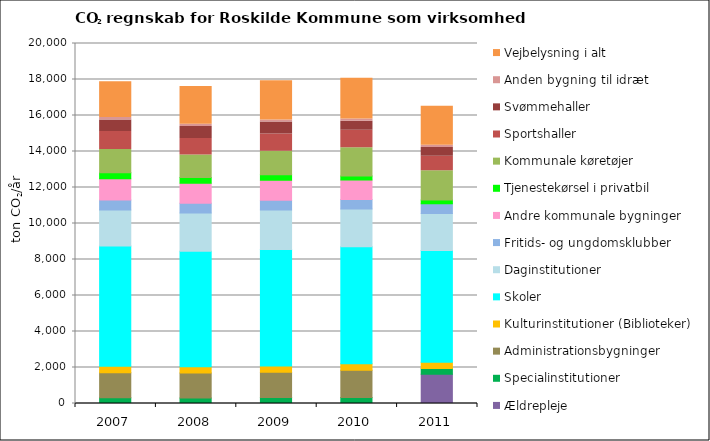
| Category | Ældrepleje | Specialinstitutioner | Administrationsbygninger | Kulturinstitutioner (Biblioteker) | Skoler | Daginstitutioner | Fritids- og ungdomsklubber | Andre kommunale bygninger | Tjenestekørsel i privatbil | Kommunale køretøjer | Sportshaller | Svømmehaller | Anden bygning til idræt | Vejbelysning i alt |
|---|---|---|---|---|---|---|---|---|---|---|---|---|---|---|
| 2007.0 | 0 | 316.544 | 1389.446 | 369.022 | 6676.339 | 2002.385 | 547.636 | 1187.609 | 325.086 | 1297.154 | 997.976 | 640.79 | 133.08 | 1989.346 |
| 2008.0 | 0 | 309.677 | 1388.317 | 338.572 | 6420.941 | 2126.266 | 537.524 | 1121.291 | 314.2 | 1244.761 | 926.201 | 659.856 | 130.123 | 2092.846 |
| 2009.0 | 0 | 327.222 | 1412.44 | 337.569 | 6474.933 | 2197.595 | 542.109 | 1104.341 | 306.237 | 1317.469 | 946.638 | 666.363 | 123.948 | 2173.098 |
| 2010.0 | 0 | 331.244 | 1518.906 | 359.926 | 6495.503 | 2100.714 | 527.316 | 1086.78 | 215.672 | 1572.515 | 969.566 | 504.925 | 122.492 | 2257.444 |
| 2011.0 | 1630.289 | 318.15 | 0 | 340.085 | 6209.982 | 2061.977 | 542.365 | 0 | 200.738 | 1620.302 | 806.124 | 495.875 | 127.149 | 2159.502 |